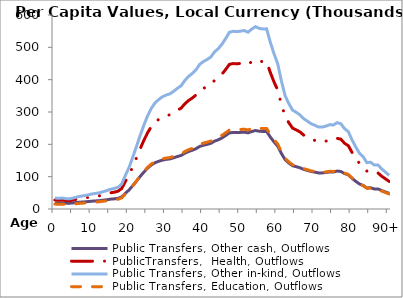
| Category | Public Transfers, Other cash, Outflows | PublicTransfers,  Health, Outflows | Public Transfers, Other in-kind, Outflows | Public Transfers, Education, Outflows |
|---|---|---|---|---|
| 0 | 18923.035 | 27764.325 | 33922.956 | 15165.434 |
|  | 18585.019 | 27109.336 | 33122.679 | 14807.666 |
| 2 | 18852.782 | 27628.193 | 33756.628 | 15091.076 |
| 3 | 18139.046 | 26245.157 | 32066.809 | 14335.634 |
| 4 | 17866.438 | 25716.913 | 31421.391 | 14047.096 |
| 5 | 18979.192 | 27873.141 | 34055.91 | 15224.871 |
| 6 | 20324.768 | 30480.519 | 37241.651 | 16649.074 |
| 7 | 21274.008 | 32319.901 | 39489.042 | 17653.781 |
| 8 | 22114.951 | 33949.43 | 41480.031 | 18543.863 |
| 9 | 23087.652 | 35834.273 | 43782.966 | 19573.402 |
| 10 | 24213.461 | 38015.799 | 46448.393 | 20764.996 |
| 11 | 25014.619 | 39568.236 | 48345.189 | 21612.968 |
| 12 | 25750.364 | 40993.92 | 50087.115 | 22391.705 |
| 13 | 27238.425 | 43877.397 | 53610.2 | 23966.719 |
| 14 | 28650.204 | 46613.059 | 56952.682 | 25460.992 |
| 15 | 30404.575 | 50012.574 | 61106.272 | 27317.876 |
| 16 | 31428.666 | 51996.998 | 63530.876 | 28401.808 |
| 17 | 32956.978 | 54958.471 | 67149.257 | 30019.424 |
| 18 | 37299.602 | 63373.351 | 77430.711 | 34615.802 |
| 19 | 48665.734 | 85397.971 | 104340.792 | 46646.093 |
| 20 | 59131.458 | 105677.835 | 129119.098 | 57723.364 |
| 21 | 72690.762 | 131952.255 | 161221.661 | 72074.981 |
| 22 | 86650.294 | 159002.211 | 194271.789 | 86850.213 |
| 23 | 101110.15 | 187021.668 | 228506.47 | 102155.005 |
| 24 | 114638.095 | 213235.321 | 260534.788 | 116473.43 |
| 25 | 126634.085 | 236480.444 | 288936.1 | 129170.385 |
| 26 | 136317.426 | 255244.251 | 311862.061 | 139419.555 |
| 27 | 143308.319 | 268790.791 | 328413.469 | 146818.948 |
| 28 | 147741.406 | 277380.965 | 338909.1 | 151511.074 |
| 29 | 151310.097 | 284296.164 | 347358.216 | 155288.295 |
| 30 | 153508.691 | 288556.471 | 352563.536 | 157615.361 |
| 31 | 154998.711 | 291443.744 | 356091.259 | 159192.447 |
| 32 | 158433.44 | 298099.359 | 364223.21 | 162827.878 |
| 33 | 162314.62 | 305620.079 | 373412.163 | 166935.847 |
| 34 | 165619.622 | 312024.318 | 381236.977 | 170433.971 |
| 35 | 172520.425 | 325396.288 | 397575.093 | 177738.011 |
| 36 | 177797.646 | 335622.174 | 410069.267 | 183323.596 |
| 37 | 181714.622 | 343212.259 | 419342.971 | 187469.454 |
| 38 | 186475.121 | 352436.874 | 430613.772 | 192508.124 |
| 39 | 193560.65 | 366166.795 | 447389.239 | 200007.684 |
| 40 | 197199.049 | 373217.07 | 456003.393 | 203858.686 |
| 41 | 199909.211 | 378468.662 | 462419.884 | 206727.212 |
| 42 | 203243.717 | 384930.07 | 470314.549 | 210256.563 |
| 43 | 209853.801 | 397738.701 | 485964.368 | 217252.895 |
| 44 | 214040.016 | 405850.501 | 495875.512 | 221683.724 |
| 45 | 219870.666 | 417148.792 | 509679.969 | 227855.078 |
| 46 | 227399.686 | 431738.082 | 527505.429 | 235824.043 |
| 47 | 235524.64 | 447482.139 | 546741.803 | 244423.764 |
| 48 | 236708.7 | 449776.541 | 549545.146 | 245677.013 |
| 49 | 236395.08 | 449168.827 | 548802.629 | 245345.067 |
| 50 | 236920.938 | 450187.804 | 550047.633 | 245901.652 |
| 51 | 237717.498 | 451731.33 | 551933.542 | 246744.757 |
| 52 | 235511.202 | 447456.099 | 546709.987 | 244409.54 |
| 53 | 239609.029 | 455396.628 | 556411.869 | 248746.817 |
| 54 | 242735.943 | 461455.776 | 563815.046 | 252056.446 |
| 55 | 240586.852 | 457291.394 | 558726.929 | 249781.777 |
| 56 | 239777.075 | 455722.257 | 556809.728 | 248924.682 |
| 57 | 239938.419 | 456034.9 | 557191.722 | 249095.454 |
| 58 | 222625.633 | 422487.205 | 516202.539 | 230771.027 |
| 59 | 207465.295 | 393110.394 | 480309.418 | 214724.821 |
| 60 | 194313.997 | 367626.586 | 449172.839 | 200805.051 |
| 61 | 171621.772 | 323654.93 | 395447.471 | 176786.846 |
| 62 | 152455.972 | 286516.574 | 350071.153 | 156501.128 |
| 63 | 142206.02 | 266654.821 | 325803.703 | 145652.238 |
| 64 | 133741.518 | 250252.808 | 305763.425 | 136693.128 |
| 65 | 130846.886 | 244643.761 | 298910.189 | 133629.353 |
| 66 | 127558.145 | 238271.032 | 291123.874 | 130148.44 |
| 67 | 122533.081 | 228533.76 | 279226.698 | 124829.746 |
| 68 | 119322.946 | 222313.35 | 271626.488 | 121432.033 |
| 69 | 116004.563 | 215883.184 | 263769.994 | 117919.746 |
| 70 | 113970.872 | 211942.417 | 258955.094 | 115767.22 |
| 71 | 111678.494 | 207500.382 | 253527.735 | 113340.891 |
| 72 | 111638.998 | 207423.848 | 253434.225 | 113299.087 |
| 73 | 112943.234 | 209951.121 | 256522.092 | 114679.534 |
| 74 | 114670.218 | 213297.567 | 260610.841 | 116507.431 |
| 75 | 114375.653 | 212726.777 | 259913.44 | 116195.654 |
| 76 | 117363.61 | 218516.665 | 266987.629 | 119358.207 |
| 77 | 115988.298 | 215851.665 | 263731.484 | 117902.53 |
| 78 | 109506.693 | 203291.994 | 248385.849 | 111042.185 |
| 79 | 105645.981 | 195810.933 | 239245.354 | 106955.879 |
| 80 | 94948.109 | 175081.228 | 213917.424 | 95632.896 |
| 81 | 85709.987 | 157180.141 | 192045.55 | 85854.961 |
| 82 | 77467.825 | 141208.964 | 172531.677 | 77131.183 |
| 83 | 72929.317 | 132414.513 | 161786.456 | 72327.476 |
| 84 | 65132.742 | 117306.77 | 143327.541 | 64075.322 |
| 85 | 65693.567 | 118393.503 | 144655.332 | 64668.918 |
| 86 | 62021.039 | 111277.094 | 135960.374 | 60781.792 |
| 87 | 62104.708 | 111439.224 | 136158.468 | 60870.35 |
| 88 | 56921.534 | 101395.574 | 123886.954 | 55384.306 |
| 89 | 52772.301 | 93355.435 | 114063.366 | 50992.621 |
| 90+ | 48623.068 | 85315.297 | 104239.779 | 46600.935 |